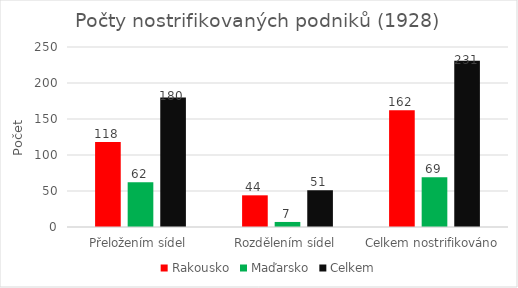
| Category | Rakousko | Maďarsko | Celkem |
|---|---|---|---|
| Přeložením sídel | 118 | 62 | 180 |
| Rozdělením sídel | 44 | 7 | 51 |
| Celkem nostrifikováno | 162 | 69 | 231 |